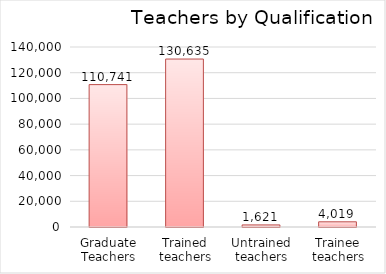
| Category | Series 0 |
|---|---|
| Graduate Teachers | 110741 |
| Trained teachers | 130635 |
| Untrained teachers | 1621 |
| Trainee teachers | 4019 |